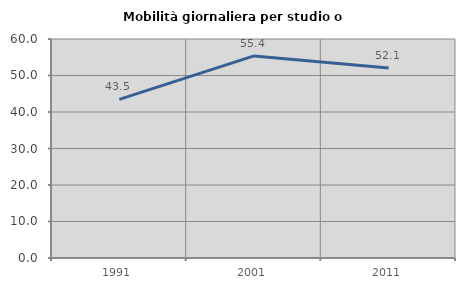
| Category | Mobilità giornaliera per studio o lavoro |
|---|---|
| 1991.0 | 43.474 |
| 2001.0 | 55.375 |
| 2011.0 | 52.078 |